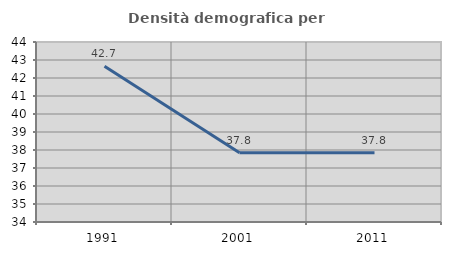
| Category | Densità demografica |
|---|---|
| 1991.0 | 42.656 |
| 2001.0 | 37.843 |
| 2011.0 | 37.843 |